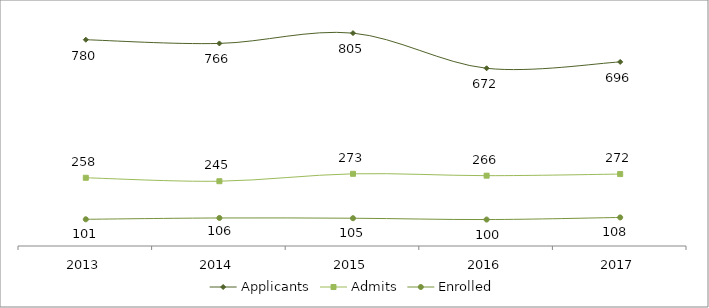
| Category | Applicants | Admits | Enrolled |
|---|---|---|---|
| 2013 | 780 | 258 | 101 |
| 2014 | 766 | 245 | 106 |
| 2015 | 805 | 273 | 105 |
| 2016 | 672 | 266 | 100 |
| 2017 | 696 | 272 | 108 |